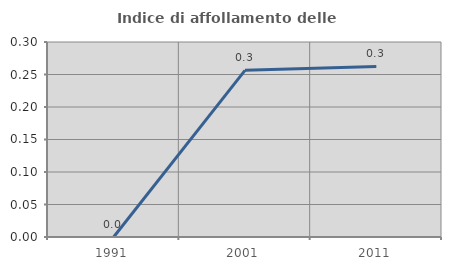
| Category | Indice di affollamento delle abitazioni  |
|---|---|
| 1991.0 | 0 |
| 2001.0 | 0.256 |
| 2011.0 | 0.262 |